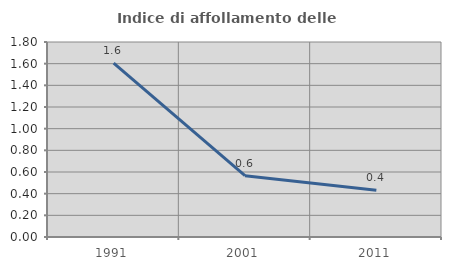
| Category | Indice di affollamento delle abitazioni  |
|---|---|
| 1991.0 | 1.606 |
| 2001.0 | 0.566 |
| 2011.0 | 0.432 |